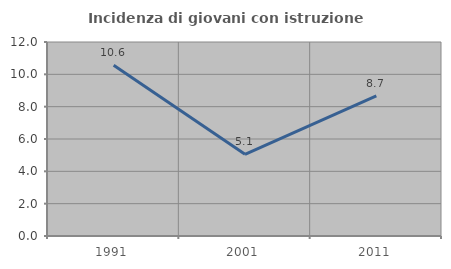
| Category | Incidenza di giovani con istruzione universitaria |
|---|---|
| 1991.0 | 10.563 |
| 2001.0 | 5.056 |
| 2011.0 | 8.667 |